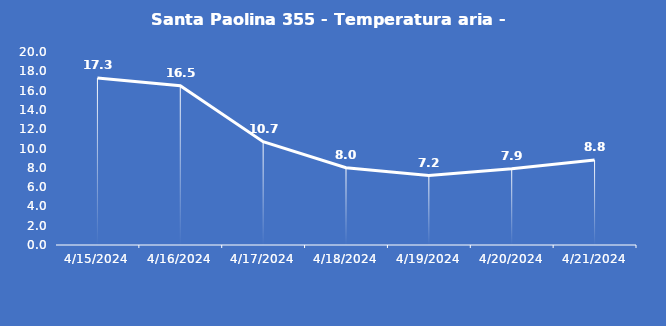
| Category | Santa Paolina 355 - Temperatura aria - Grezzo (°C) |
|---|---|
| 4/15/24 | 17.3 |
| 4/16/24 | 16.5 |
| 4/17/24 | 10.7 |
| 4/18/24 | 8 |
| 4/19/24 | 7.2 |
| 4/20/24 | 7.9 |
| 4/21/24 | 8.8 |